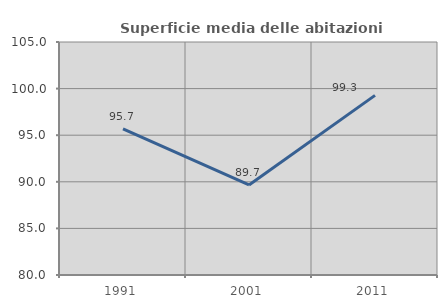
| Category | Superficie media delle abitazioni occupate |
|---|---|
| 1991.0 | 95.677 |
| 2001.0 | 89.66 |
| 2011.0 | 99.276 |